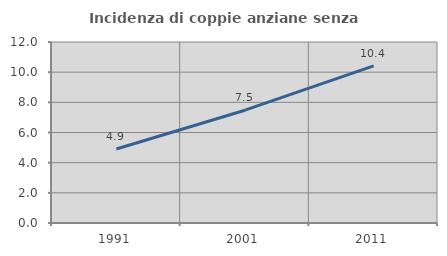
| Category | Incidenza di coppie anziane senza figli  |
|---|---|
| 1991.0 | 4.909 |
| 2001.0 | 7.478 |
| 2011.0 | 10.421 |